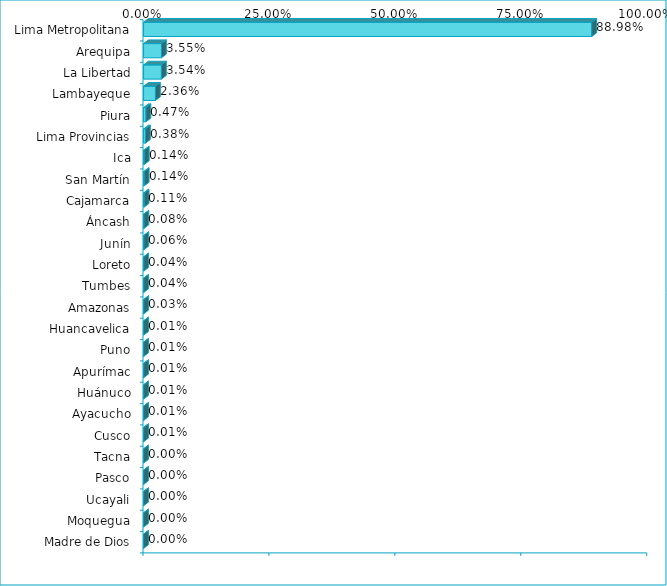
| Category | Series 0 |
|---|---|
| Lima Metropolitana | 0.89 |
| Arequipa | 0.036 |
| La Libertad | 0.035 |
| Lambayeque | 0.024 |
| Piura | 0.005 |
| Lima Provincias | 0.004 |
| Ica | 0.001 |
| San Martín | 0.001 |
| Cajamarca | 0.001 |
| Áncash | 0.001 |
| Junín | 0.001 |
| Loreto | 0 |
| Tumbes | 0 |
| Amazonas | 0 |
| Huancavelica | 0 |
| Puno | 0 |
| Apurímac | 0 |
| Huánuco | 0 |
| Ayacucho | 0 |
| Cusco | 0 |
| Tacna | 0 |
| Pasco | 0 |
| Ucayali | 0 |
| Moquegua | 0 |
| Madre de Dios | 0 |